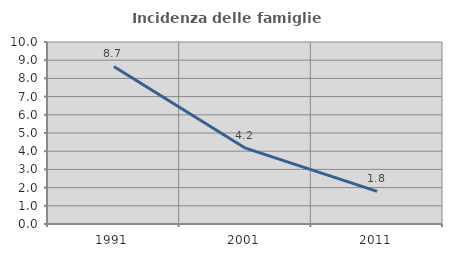
| Category | Incidenza delle famiglie numerose |
|---|---|
| 1991.0 | 8.657 |
| 2001.0 | 4.167 |
| 2011.0 | 1.792 |